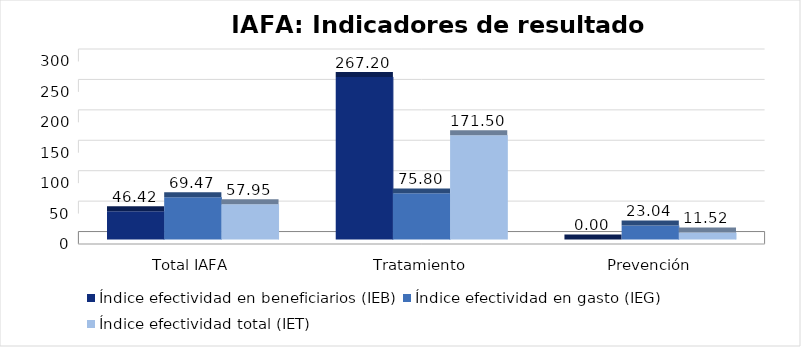
| Category | Índice efectividad en beneficiarios (IEB) | Índice efectividad en gasto (IEG)  | Índice efectividad total (IET) |
|---|---|---|---|
| Total IAFA | 46.422 | 69.474 | 57.948 |
| Tratamiento | 267.201 | 75.802 | 171.501 |
| Prevención | 0 | 23.035 | 11.518 |